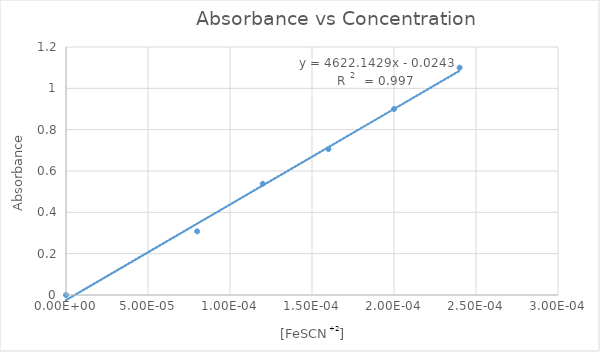
| Category | Absorbance  |
|---|---|
| 0.0 | 0 |
| 8e-05 | 0.308 |
| 0.00012 | 0.538 |
| 0.00016 | 0.706 |
| 0.0002 | 0.9 |
| 0.00024 | 1.1 |